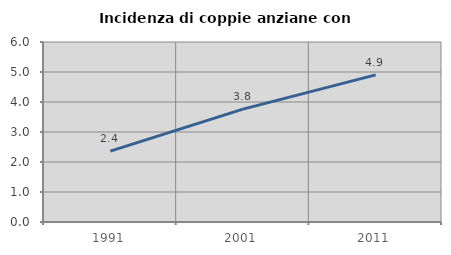
| Category | Incidenza di coppie anziane con figli |
|---|---|
| 1991.0 | 2.364 |
| 2001.0 | 3.762 |
| 2011.0 | 4.905 |